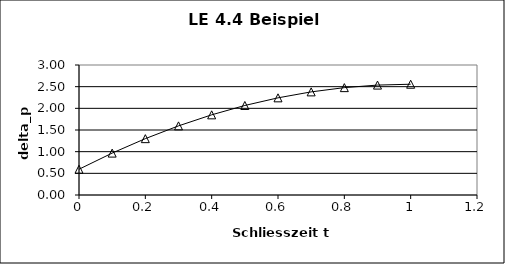
| Category | Series 0 |
|---|---|
| 0.0 | 0.594 |
| 0.1 | 0.967 |
| 0.2 | 1.301 |
| 0.3 | 1.595 |
| 0.4 | 1.85 |
| 0.5 | 2.066 |
| 0.6 | 2.242 |
| 0.7 | 2.38 |
| 0.8 | 2.478 |
| 0.9 | 2.537 |
| 1.0 | 2.556 |